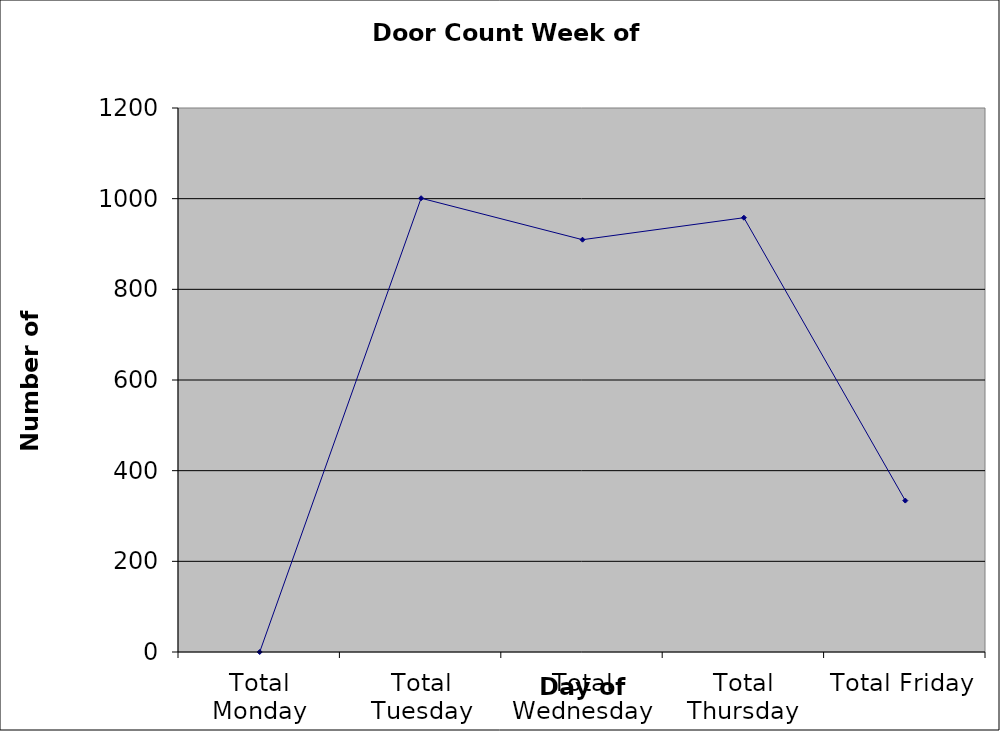
| Category | Series 0 |
|---|---|
| Total Monday | 0 |
| Total Tuesday | 1001 |
| Total Wednesday | 909.5 |
| Total Thursday | 958 |
| Total Friday | 334 |